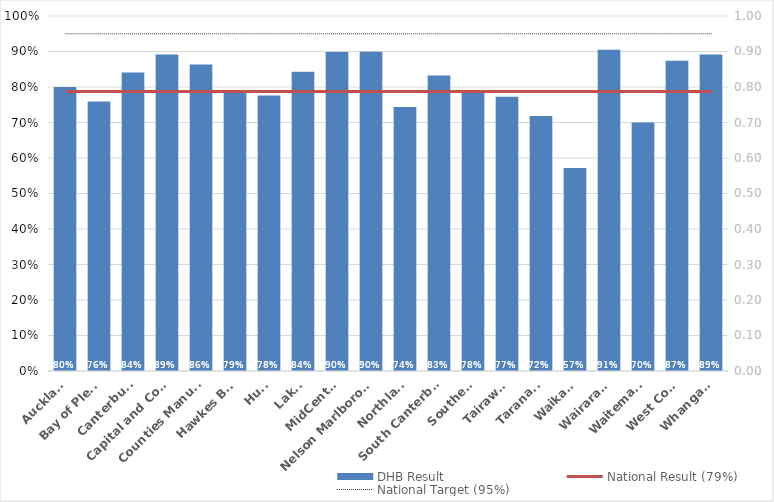
| Category | DHB Result |
|---|---|
| Auckland | 0.8 |
| Bay of Plenty | 0.759 |
| Canterbury | 0.841 |
| Capital and Coast | 0.892 |
| Counties Manukau | 0.863 |
| Hawkes Bay | 0.788 |
| Hutt | 0.776 |
| Lakes | 0.843 |
| MidCentral | 0.898 |
| Nelson Marlborough | 0.899 |
| Northland | 0.744 |
| South Canterbury | 0.833 |
| Southern | 0.784 |
| Tairawhiti | 0.772 |
| Taranaki | 0.718 |
| Waikato | 0.572 |
| Wairarapa | 0.905 |
| Waitemata | 0.7 |
| West Coast | 0.874 |
| Whanganui | 0.892 |